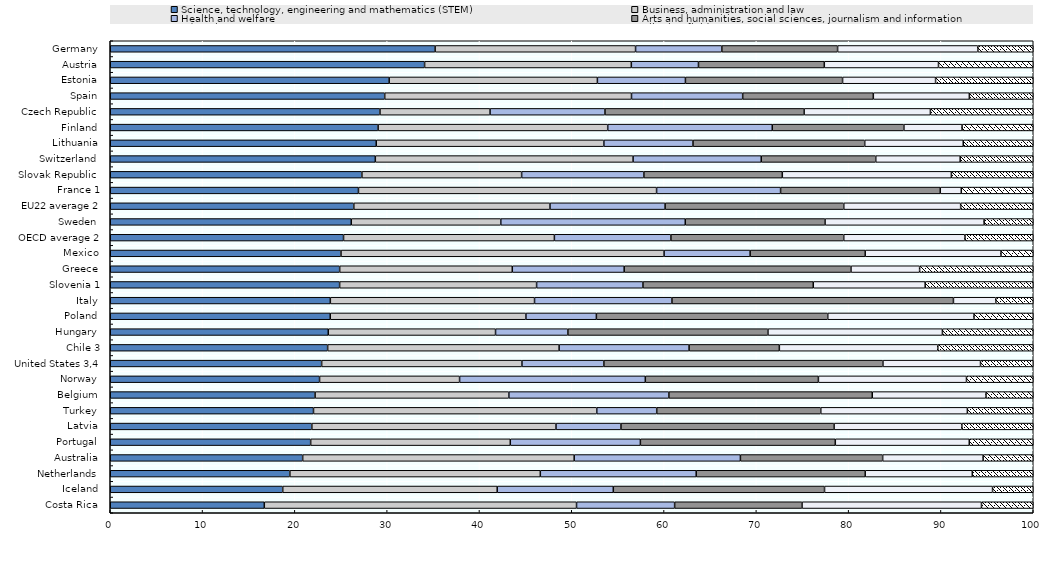
| Category | Science, technology, engineering and mathematics (STEM) | Business, administration and law | Health and welfare | Arts and humanities, social sciences, journalism and information | Education | All other fields |
|---|---|---|---|---|---|---|
| Costa Rica  | 16.691 | 33.828 | 10.628 | 13.805 | 19.44 | 5.608 |
| Iceland  | 18.687 | 23.238 | 12.577 | 22.886 | 18.205 | 4.408 |
| Netherlands  | 19.459 | 27.135 | 16.89 | 18.309 | 11.603 | 6.603 |
| Australia  | 20.848 | 29.416 | 18.009 | 15.412 | 10.885 | 5.43 |
| Portugal  | 21.714 | 21.627 | 14.096 | 21.118 | 14.515 | 6.93 |
| Latvia  | 21.84 | 26.453 | 7.039 | 23.093 | 13.842 | 7.734 |
| Turkey  | 22.021 | 30.688 | 6.497 | 17.774 | 15.883 | 7.136 |
| Belgium  | 22.192 | 20.994 | 17.335 | 22.037 | 12.324 | 5.117 |
| Norway  | 22.677 | 15.17 | 20.123 | 18.752 | 16.044 | 7.233 |
| United States 3,4 | 22.903 | 21.702 | 8.875 | 30.236 | 10.572 | 5.712 |
| Chile 3 | 23.554 | 25.077 | 14.081 | 9.779 | 17.172 | 10.337 |
| Hungary  | 23.621 | 18.122 | 7.839 | 21.677 | 18.902 | 9.84 |
| Poland  | 23.834 | 21.199 | 7.635 | 25.068 | 15.845 | 6.419 |
| Italy  | 23.844 | 22.125 | 14.887 | 30.497 | 4.59 | 4.057 |
| Slovenia 1 | 24.852 | 21.34 | 11.522 | 18.452 | 12.123 | 11.71 |
| Greece  | 24.856 | 18.701 | 12.123 | 24.573 | 7.438 | 12.309 |
| Mexico  | 24.999 | 35.004 | 9.323 | 12.468 | 14.709 | 3.496 |
| OECD average 2 | 25.275 | 22.846 | 12.622 | 18.726 | 13.136 | 7.396 |
| Sweden  | 26.113 | 16.198 | 19.988 | 15.146 | 17.23 | 5.324 |
| EU22 average 2 | 26.387 | 21.255 | 12.472 | 19.357 | 12.665 | 7.864 |
| France 1 | 26.892 | 32.3 | 13.434 | 17.301 | 2.276 | 7.797 |
| Slovak Republic  | 27.264 | 17.306 | 13.245 | 14.998 | 18.318 | 8.87 |
| Switzerland  | 28.718 | 27.927 | 13.885 | 12.406 | 9.147 | 7.917 |
| Lithuania  | 28.818 | 24.662 | 9.656 | 18.606 | 10.675 | 7.583 |
| Finland  | 29.022 | 24.876 | 17.828 | 14.262 | 6.302 | 7.711 |
| Czech Republic  | 29.222 | 11.927 | 12.449 | 21.578 | 13.682 | 11.142 |
| Spain  | 29.736 | 26.738 | 12.045 | 14.154 | 10.403 | 6.924 |
| Estonia  | 30.221 | 22.559 | 9.536 | 17.026 | 10.077 | 10.581 |
| Austria  | 34.058 | 22.397 | 7.273 | 13.633 | 12.372 | 10.266 |
| Germany  | 35.197 | 21.717 | 9.344 | 12.545 | 15.196 | 6.001 |